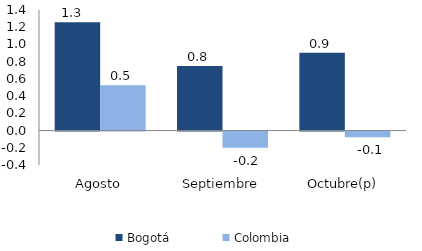
| Category | Bogotá | Colombia |
|---|---|---|
| Agosto | 1.256 | 0.527 |
| Septiembre | 0.75 | -0.187 |
| Octubre(p) | 0.903 | -0.066 |